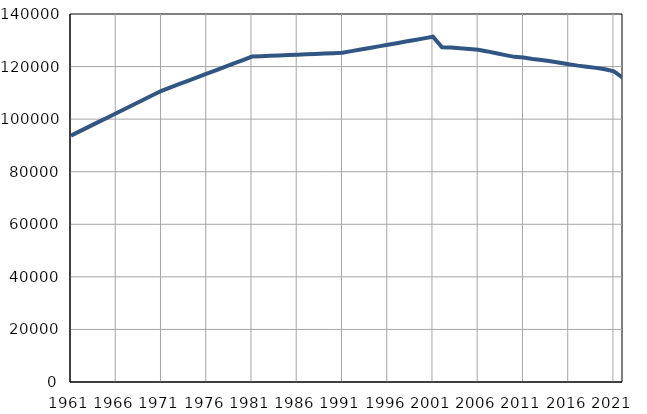
| Category | Број
становника |
|---|---|
| 1961.0 | 93744 |
| 1962.0 | 95448 |
| 1963.0 | 97151 |
| 1964.0 | 98855 |
| 1965.0 | 100558 |
| 1966.0 | 102262 |
| 1967.0 | 103966 |
| 1968.0 | 105669 |
| 1969.0 | 107373 |
| 1970.0 | 109076 |
| 1971.0 | 110780 |
| 1972.0 | 112081 |
| 1973.0 | 113382 |
| 1974.0 | 114683 |
| 1975.0 | 115984 |
| 1976.0 | 117285 |
| 1977.0 | 118587 |
| 1978.0 | 119888 |
| 1979.0 | 121189 |
| 1980.0 | 122490 |
| 1981.0 | 123791 |
| 1982.0 | 123938 |
| 1983.0 | 124085 |
| 1984.0 | 124232 |
| 1985.0 | 124379 |
| 1986.0 | 124526 |
| 1987.0 | 124672 |
| 1988.0 | 124820 |
| 1989.0 | 124967 |
| 1990.0 | 125113 |
| 1991.0 | 125261 |
| 1992.0 | 125868 |
| 1993.0 | 126475 |
| 1994.0 | 127082 |
| 1995.0 | 127689 |
| 1996.0 | 128296 |
| 1997.0 | 128903 |
| 1998.0 | 129510 |
| 1999.0 | 130117 |
| 2000.0 | 130724 |
| 2001.0 | 131331 |
| 2002.0 | 127296 |
| 2003.0 | 127210 |
| 2004.0 | 126960 |
| 2005.0 | 126716 |
| 2006.0 | 126388 |
| 2007.0 | 125769 |
| 2008.0 | 125038 |
| 2009.0 | 124362 |
| 2010.0 | 123700 |
| 2011.0 | 123445 |
| 2012.0 | 122916 |
| 2013.0 | 122492 |
| 2014.0 | 122013 |
| 2015.0 | 121482 |
| 2016.0 | 120871 |
| 2017.0 | 120361 |
| 2018.0 | 119960 |
| 2019.0 | 119509 |
| 2020.0 | 118971 |
| 2021.0 | 118163 |
| 2022.0 | 115664 |